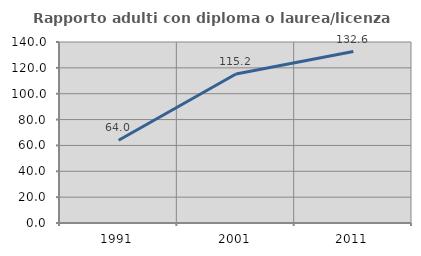
| Category | Rapporto adulti con diploma o laurea/licenza media  |
|---|---|
| 1991.0 | 64 |
| 2001.0 | 115.217 |
| 2011.0 | 132.609 |